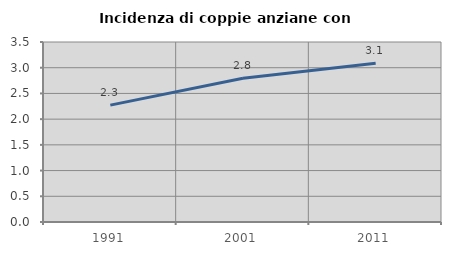
| Category | Incidenza di coppie anziane con figli |
|---|---|
| 1991.0 | 2.273 |
| 2001.0 | 2.796 |
| 2011.0 | 3.089 |